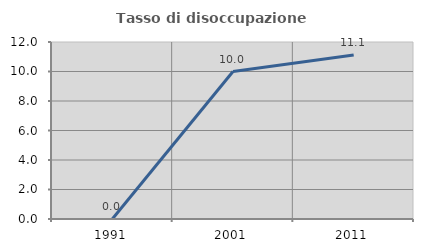
| Category | Tasso di disoccupazione giovanile  |
|---|---|
| 1991.0 | 0 |
| 2001.0 | 10 |
| 2011.0 | 11.111 |